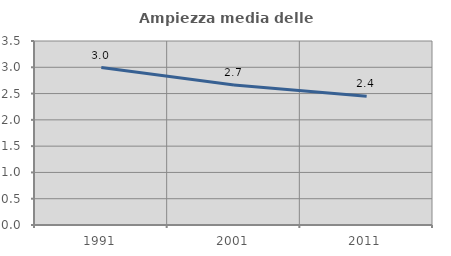
| Category | Ampiezza media delle famiglie |
|---|---|
| 1991.0 | 2.995 |
| 2001.0 | 2.664 |
| 2011.0 | 2.449 |